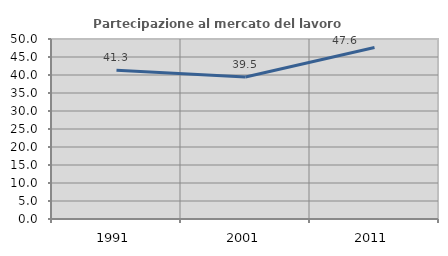
| Category | Partecipazione al mercato del lavoro  femminile |
|---|---|
| 1991.0 | 41.341 |
| 2001.0 | 39.459 |
| 2011.0 | 47.619 |